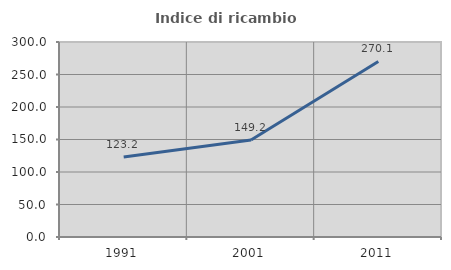
| Category | Indice di ricambio occupazionale  |
|---|---|
| 1991.0 | 123.155 |
| 2001.0 | 149.227 |
| 2011.0 | 270.06 |